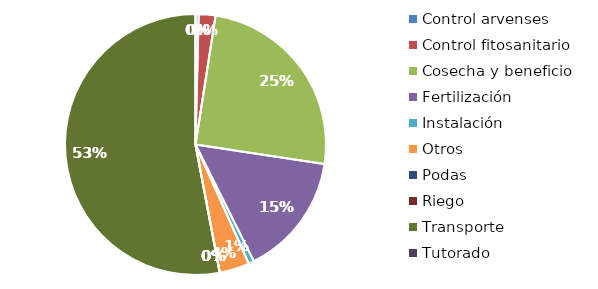
| Category | Valor |
|---|---|
| Control arvenses | 363780 |
| Control fitosanitario | 1948605 |
| Cosecha y beneficio | 23428263.185 |
| Fertilización | 14310639 |
| Instalación | 638003.468 |
| Otros | 3493602 |
| Podas | 0 |
| Riego | 0 |
| Transporte | 49782330 |
| Tutorado | 0 |